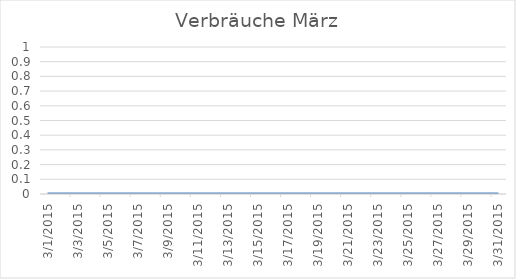
| Category | Series 0 |
|---|---|
| 01/03/2015 | 0 |
| 02/03/2015 | 0 |
| 03/03/2015 | 0 |
| 04/03/2015 | 0 |
| 05/03/2015 | 0 |
| 06/03/2015 | 0 |
| 07/03/2015 | 0 |
| 08/03/2015 | 0 |
| 09/03/2015 | 0 |
| 10/03/2015 | 0 |
| 11/03/2015 | 0 |
| 12/03/2015 | 0 |
| 13/03/2015 | 0 |
| 14/03/2015 | 0 |
| 15/03/2015 | 0 |
| 16/03/2015 | 0 |
| 17/03/2015 | 0 |
| 18/03/2015 | 0 |
| 19/03/2015 | 0 |
| 20/03/2015 | 0 |
| 21/03/2015 | 0 |
| 22/03/2015 | 0 |
| 23/03/2015 | 0 |
| 24/03/2015 | 0 |
| 25/03/2015 | 0 |
| 26/03/2015 | 0 |
| 27/03/2015 | 0 |
| 28/03/2015 | 0 |
| 29/03/2015 | 0 |
| 30/03/2015 | 0 |
| 31/03/2015 | 0 |